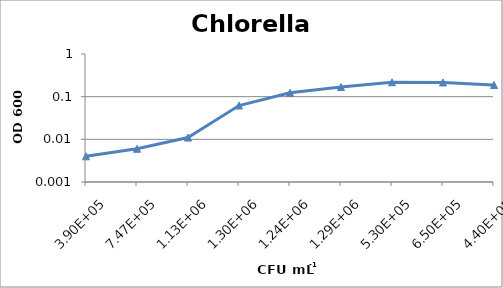
| Category | Chlorella sp. |
|---|---|
| 390000.0 | 0.004 |
| 746666.666666667 | 0.006 |
| 1130000.0 | 0.011 |
| 1300000.0 | 0.062 |
| 1240000.0 | 0.124 |
| 1286666.66666667 | 0.168 |
| 530000.0 | 0.218 |
| 650000.0 | 0.216 |
| 440000.0 | 0.188 |